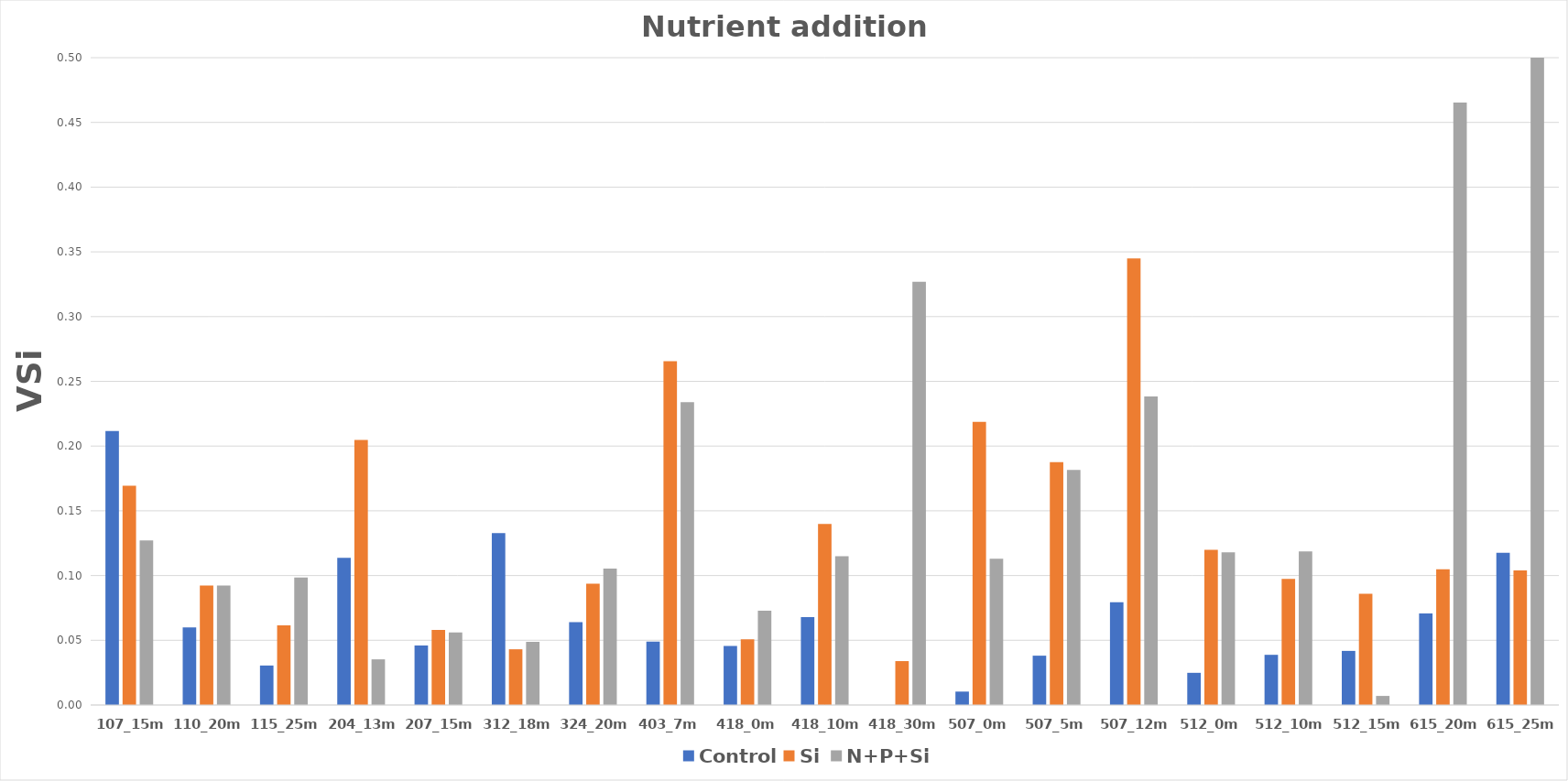
| Category | Control | Si | N+P+Si |
|---|---|---|---|
| 107_15m | 0.212 | 0.169 | 0.127 |
| 110_20m | 0.06 | 0.092 | 0.092 |
| 115_25m | 0.031 | 0.062 | 0.099 |
| 204_13m | 0.114 | 0.205 | 0.035 |
| 207_15m | 0.046 | 0.058 | 0.056 |
| 312_18m | 0.133 | 0.043 | 0.049 |
| 324_20m | 0.064 | 0.094 | 0.105 |
| 403_7m | 0.049 | 0.266 | 0.234 |
| 418_0m | 0.046 | 0.051 | 0.073 |
| 418_10m | 0.068 | 0.14 | 0.115 |
| 418_30m | 0 | 0.034 | 0.327 |
| 507_0m | 0.01 | 0.219 | 0.113 |
| 507_5m | 0.038 | 0.188 | 0.182 |
| 507_12m | 0.079 | 0.345 | 0.238 |
| 512_0m | 0.025 | 0.12 | 0.118 |
| 512_10m | 0.039 | 0.097 | 0.119 |
| 512_15m | 0.042 | 0.086 | 0.007 |
| 615_20m | 0.071 | 0.105 | 0.465 |
| 615_25m | 0.118 | 0.104 | 0.79 |